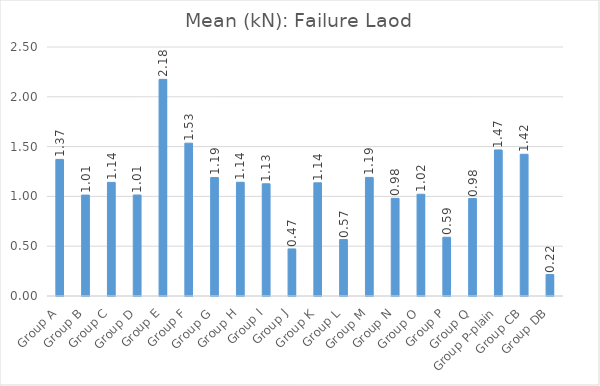
| Category | Mean |
|---|---|
| Group A | 1.371 |
| Group B | 1.013 |
| Group C | 1.141 |
| Group D | 1.014 |
| Group E | 2.175 |
| Group F | 1.535 |
| Group G | 1.19 |
| Group H | 1.142 |
| Group I | 1.126 |
| Group J | 0.472 |
| Group K | 1.136 |
| Group L | 0.567 |
| Group M | 1.191 |
| Group N | 0.98 |
| Group O | 1.022 |
| Group P | 0.59 |
| Group Q | 0.979 |
| Group P-plain | 1.467 |
| Group CB | 1.423 |
| Group DB | 0.216 |